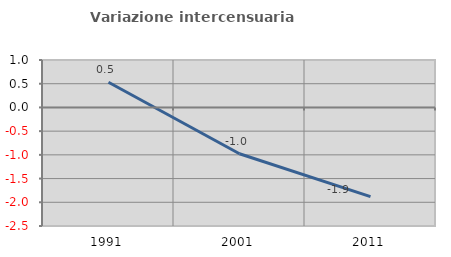
| Category | Variazione intercensuaria annua |
|---|---|
| 1991.0 | 0.531 |
| 2001.0 | -0.977 |
| 2011.0 | -1.882 |